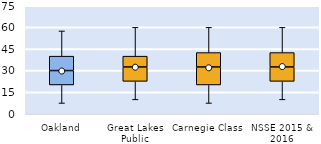
| Category | 25th | 50th | 75th |
|---|---|---|---|
| Oakland | 20 | 10 | 10 |
| Great Lakes Public | 22.5 | 10 | 7.5 |
| Carnegie Class | 20 | 12.5 | 10 |
| NSSE 2015 & 2016 | 22.5 | 10 | 10 |